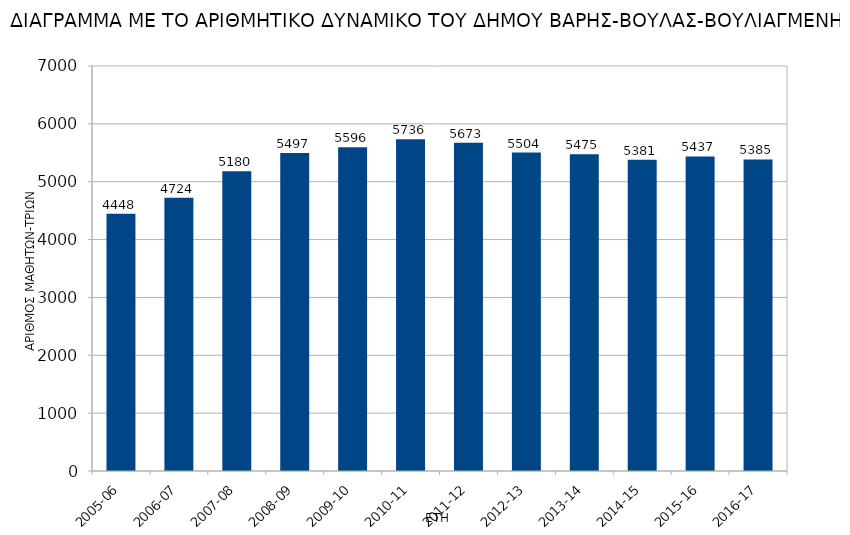
| Category | Series 0 |
|---|---|
| 2005-06 | 4448 |
| 2006-07 | 4724 |
| 2007-08 | 5180 |
| 2008-09 | 5497 |
| 2009-10 | 5596 |
| 2010-11 | 5736 |
| 2011-12 | 5673 |
| 2012-13 | 5504 |
| 2013-14 | 5475 |
| 2014-15 | 5381 |
| 2015-16 | 5437 |
| 2016-17 | 5385 |